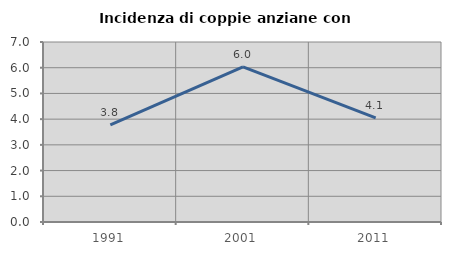
| Category | Incidenza di coppie anziane con figli |
|---|---|
| 1991.0 | 3.78 |
| 2001.0 | 6.032 |
| 2011.0 | 4.052 |